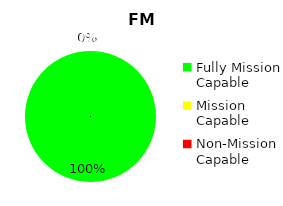
| Category | Series 0 |
|---|---|
| Fully Mission Capable | 19 |
| Mission Capable | 0 |
| Non-Mission Capable | 0 |